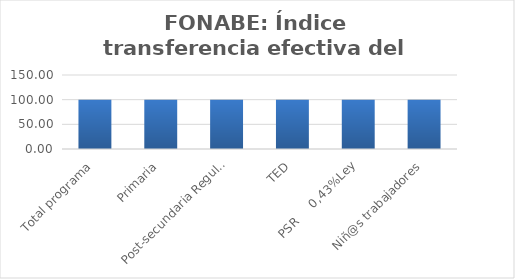
| Category | Índice transferencia efectiva del gasto (ITG) |
|---|---|
| Total programa | 100 |
| Primaria | 100 |
| Post-secundaria Regular | 100 |
| TED | 100 |
| PSR     0,43%Ley | 100 |
| Niñ@s trabajadores | 100 |